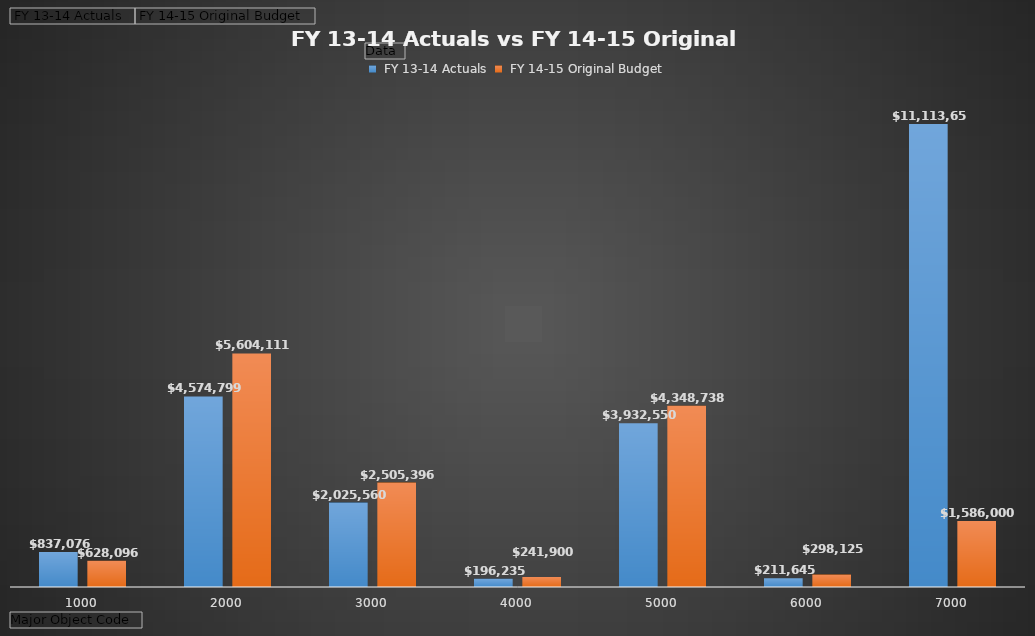
| Category |  FY 13-14 Actuals |  FY 14-15 Original Budget |
|---|---|---|
| 1000 | 837076.35 | 628096 |
| 2000 | 4574798.78 | 5604111.41 |
| 3000 | 2025560.41 | 2505396.32 |
| 4000 | 196235.09 | 241900 |
| 5000 | 3932549.72 | 4348738 |
| 6000 | 211644.9 | 298125 |
| 7000 | 11113653.09 | 1586000 |